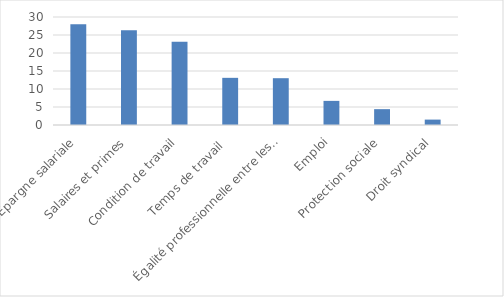
| Category | Series 0 |
|---|---|
| Épargne salariale | 28 |
| Salaires et primes | 26.3 |
| Condition de travail | 23.1 |
| Temps de travail  | 13.1 |
| Égalité professionnelle entre les femmes et les hommes | 13 |
| Emploi | 6.7 |
| Protection sociale | 4.4 |
| Droit syndical | 1.5 |